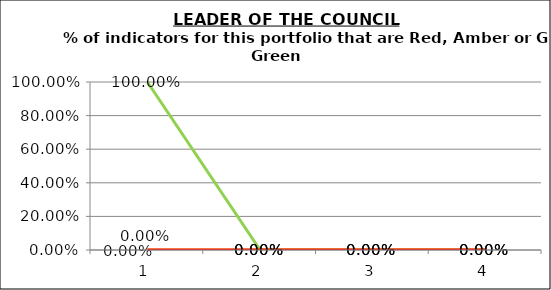
| Category | Green | Amber | Red |
|---|---|---|---|
| 0 | 1 | 0 | 0 |
| 1 | 0 | 0 | 0 |
| 2 | 0 | 0 | 0 |
| 3 | 0 | 0 | 0 |